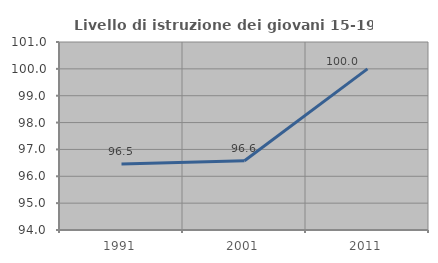
| Category | Livello di istruzione dei giovani 15-19 anni |
|---|---|
| 1991.0 | 96.46 |
| 2001.0 | 96.581 |
| 2011.0 | 100 |